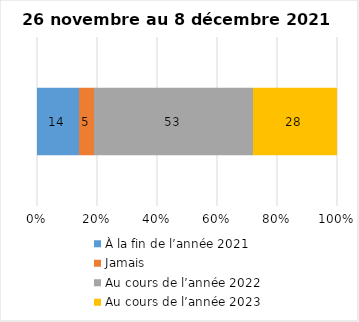
| Category | À la fin de l’année 2021 | Jamais | Au cours de l’année 2022 | Au cours de l’année 2023 |
|---|---|---|---|---|
| 0 | 14 | 5 | 53 | 28 |